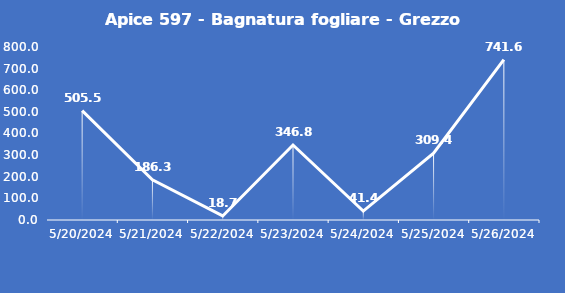
| Category | Apice 597 - Bagnatura fogliare - Grezzo (min) |
|---|---|
| 5/20/24 | 505.5 |
| 5/21/24 | 186.3 |
| 5/22/24 | 18.7 |
| 5/23/24 | 346.8 |
| 5/24/24 | 41.4 |
| 5/25/24 | 309.4 |
| 5/26/24 | 741.6 |